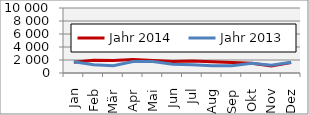
| Category | Jahr 2014 | Jahr 2013 |
|---|---|---|
| Jan | 1662.102 | 1722.562 |
| Feb | 1949.61 | 1258.256 |
| Mär | 1936.937 | 1117.573 |
| Apr | 2059.691 | 1770.392 |
| Mai | 1911.252 | 1751.387 |
| Jun | 1760.542 | 1353.444 |
| Jul | 1833.346 | 1280.274 |
| Aug | 1749.684 | 1124.602 |
| Sep | 1616.437 | 1099.97 |
| Okt | 1502.435 | 1501.025 |
| Nov | 1094.65 | 1192.173 |
| Dez | 1595.017 | 1668.697 |